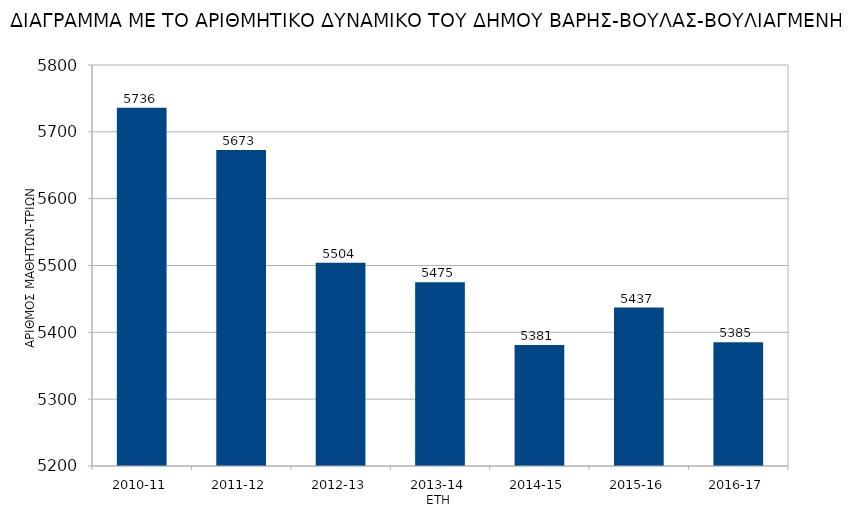
| Category | Series 0 |
|---|---|
| 2010-11 | 5736 |
| 2011-12 | 5673 |
| 2012-13 | 5504 |
| 2013-14 | 5475 |
| 2014-15 | 5381 |
| 2015-16 | 5437 |
| 2016-17 | 5385 |